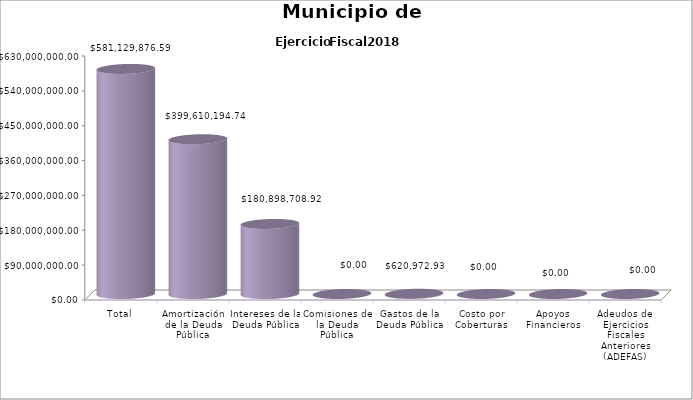
| Category | Municipio de Guadalajara
Deuda Pública 2018  Importe |
|---|---|
| Total | 581129876.59 |
| Amortización de la Deuda Pública | 399610194.74 |
| Intereses de la Deuda Pública | 180898708.92 |
| Comisiones de la Deuda Pública | 0 |
| Gastos de la Deuda Pública | 620972.93 |
| Costo por Coberturas | 0 |
| Apoyos Financieros | 0 |
| Adeudos de Ejercicios Fiscales Anteriores (ADEFAS) | 0 |